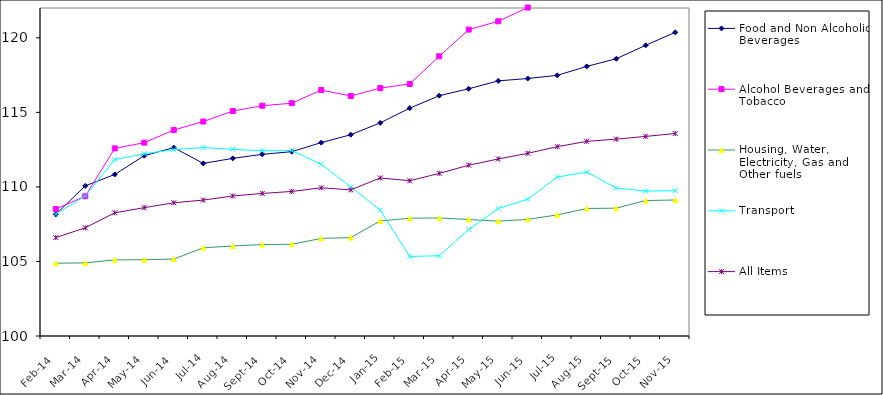
| Category | Food and Non Alcoholic Beverages | Alcohol Beverages and Tobacco | Housing, Water, Electricity, Gas and Other fuels | Transport | All Items  |
|---|---|---|---|---|---|
| 2014-02-01 | 108.156 | 108.519 | 104.883 | 108.18 | 106.601 |
| 2014-03-01 | 110.07 | 109.373 | 104.905 | 109.388 | 107.257 |
| 2014-04-01 | 110.836 | 112.583 | 105.106 | 111.837 | 108.264 |
| 2014-05-01 | 112.095 | 112.965 | 105.114 | 112.218 | 108.608 |
| 2014-06-01 | 112.634 | 113.813 | 105.162 | 112.502 | 108.936 |
| 2014-07-01 | 111.577 | 114.387 | 105.914 | 112.638 | 109.117 |
| 2014-08-01 | 111.915 | 115.087 | 106.036 | 112.525 | 109.391 |
| 2014-09-01 | 112.185 | 115.445 | 106.136 | 112.42 | 109.563 |
| 2014-10-01 | 112.363 | 115.614 | 106.151 | 112.444 | 109.694 |
| 2014-11-01 | 112.971 | 116.497 | 106.547 | 111.515 | 109.94 |
| 2014-12-01 | 113.5 | 116.1 | 106.6 | 110 | 109.8 |
| 2015-01-01 | 114.295 | 116.625 | 107.716 | 108.446 | 110.601 |
| 2015-02-01 | 115.283 | 116.906 | 107.901 | 105.333 | 110.415 |
| 2015-03-01 | 116.12 | 118.76 | 107.917 | 105.386 | 110.906 |
| 2015-04-01 | 116.582 | 120.552 | 107.812 | 107.146 | 111.458 |
| 2015-05-01 | 117.112 | 121.107 | 107.704 | 108.548 | 111.873 |
| 2015-06-01 | 117.271 | 122.03 | 107.821 | 109.182 | 112.254 |
| 2015-07-01 | 117.484 | 122.282 | 108.124 | 110.66 | 112.699 |
| 2015-08-01 | 118.084 | 123.363 | 108.552 | 111 | 113.056 |
| 2015-09-01 | 118.596 | 123.979 | 108.577 | 109.926 | 113.205 |
| 2015-10-01 | 119.501 | 123.689 | 109.085 | 109.721 | 113.387 |
| 2015-11-01 | 120.368 | 123.804 | 109.122 | 109.744 | 113.581 |